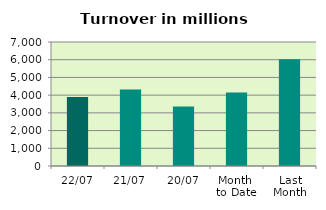
| Category | Series 0 |
|---|---|
| 22/07 | 3892.03 |
| 21/07 | 4322.588 |
| 20/07 | 3362.709 |
| Month 
to Date | 4142.82 |
| Last
Month | 6026.772 |